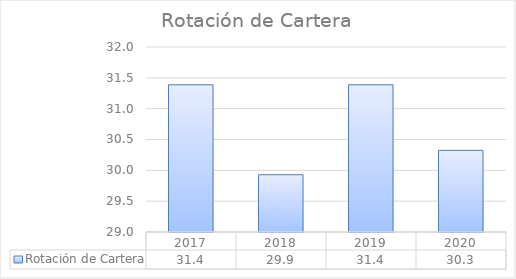
| Category | Rotación de Cartera |
|---|---|
| 2017.0 | 31.387 |
| 2018.0 | 29.929 |
| 2019.0 | 31.387 |
| 2020.0 | 30.324 |